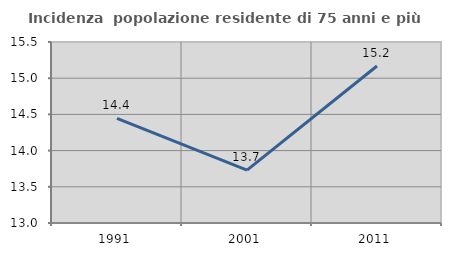
| Category | Incidenza  popolazione residente di 75 anni e più |
|---|---|
| 1991.0 | 14.444 |
| 2001.0 | 13.729 |
| 2011.0 | 15.169 |